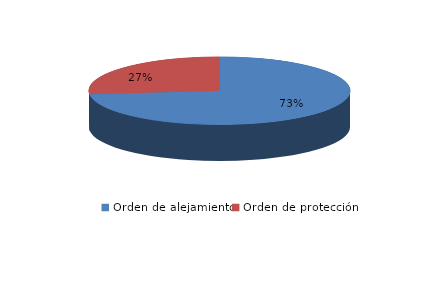
| Category | Series 0 |
|---|---|
| Orden de alejamiento | 11 |
| Orden de protección | 4 |